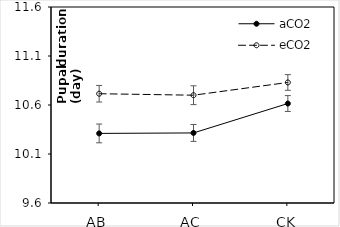
| Category | aCO2 | eCO2 |
|---|---|---|
| AB | 10.31 | 10.715 |
| AC | 10.315 | 10.7 |
| CK | 10.615 | 10.83 |